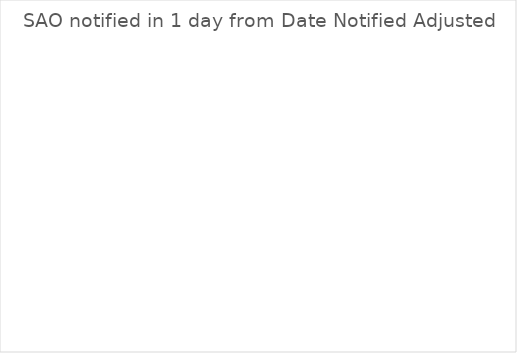
| Category | Series 0 |
|---|---|
| Compliant 24h | 0 |
| Not compliant (recorded) | 0 |
| Not compliant, SAO date missing | 0 |